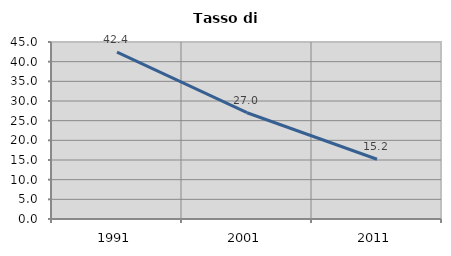
| Category | Tasso di disoccupazione   |
|---|---|
| 1991.0 | 42.418 |
| 2001.0 | 27.019 |
| 2011.0 | 15.186 |